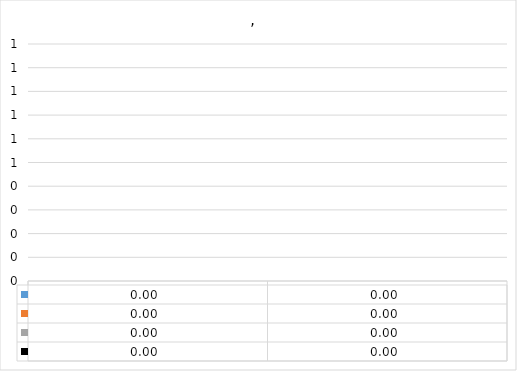
| Category | Series 0 | Series 1 | Series 2 | Series 3 |
|---|---|---|---|---|
| 0 | 0 | 0 | 0 | 0 |
| 1 | 0 | 0 | 0 | 0 |